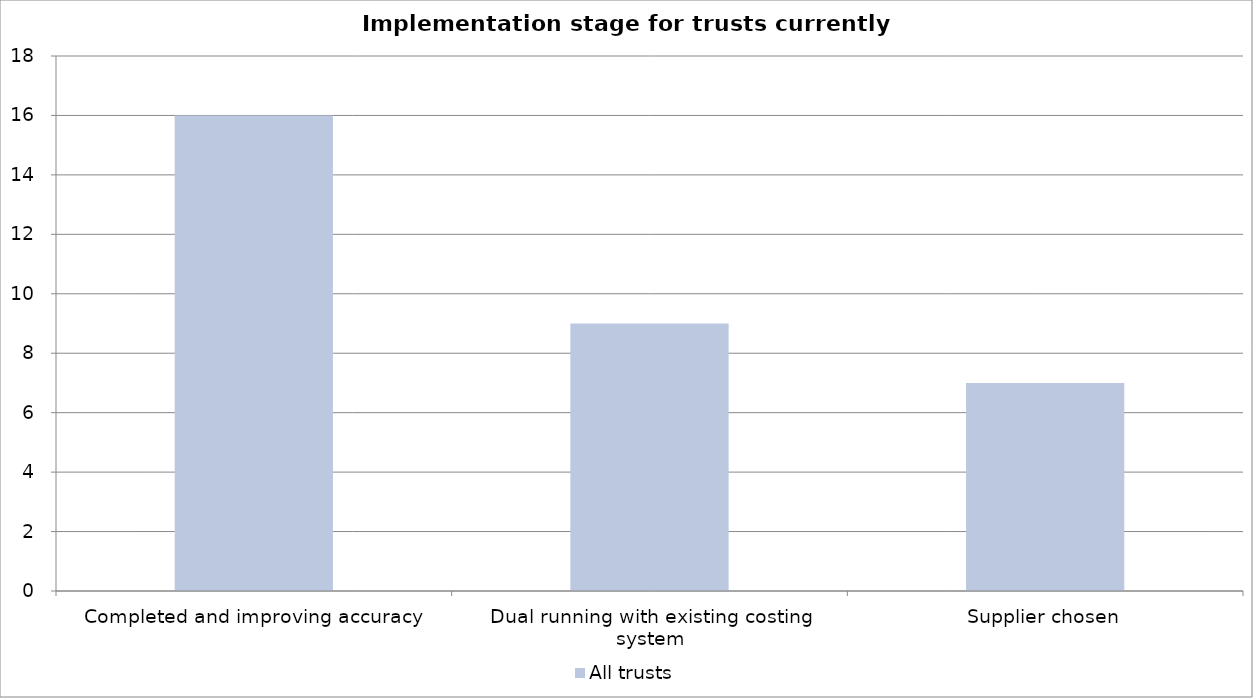
| Category | All trusts |
|---|---|
| Completed and improving accuracy | 16 |
| Dual running with existing costing system | 9 |
| Supplier chosen | 7 |